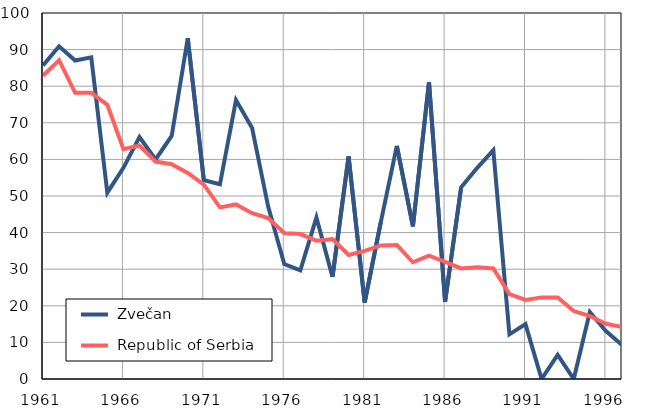
| Category |  Zvečan |  Republic of Serbia |
|---|---|---|
| 1961.0 | 85.7 | 82.9 |
| 1962.0 | 90.9 | 87.1 |
| 1963.0 | 87 | 78.2 |
| 1964.0 | 87.9 | 78.2 |
| 1965.0 | 50.9 | 74.9 |
| 1966.0 | 57.7 | 62.8 |
| 1967.0 | 66.1 | 63.8 |
| 1968.0 | 60 | 59.4 |
| 1969.0 | 66.4 | 58.7 |
| 1970.0 | 93.1 | 56.3 |
| 1971.0 | 54.3 | 53.1 |
| 1972.0 | 53.2 | 46.9 |
| 1973.0 | 76.2 | 47.7 |
| 1974.0 | 68.6 | 45.3 |
| 1975.0 | 47.1 | 44 |
| 1976.0 | 31.4 | 39.9 |
| 1977.0 | 29.7 | 39.6 |
| 1978.0 | 44.1 | 37.8 |
| 1979.0 | 27.9 | 38.2 |
| 1980.0 | 60.8 | 33.9 |
| 1981.0 | 20.9 | 35 |
| 1982.0 | 42.8 | 36.5 |
| 1983.0 | 63.7 | 36.6 |
| 1984.0 | 41.7 | 31.9 |
| 1985.0 | 81.1 | 33.7 |
| 1986.0 | 21.1 | 32 |
| 1987.0 | 52.4 | 30.2 |
| 1988.0 | 57.7 | 30.5 |
| 1989.0 | 62.5 | 30.2 |
| 1990.0 | 12.2 | 23.2 |
| 1991.0 | 15 | 21.6 |
| 1992.0 | 0 | 22.3 |
| 1993.0 | 6.6 | 22.3 |
| 1994.0 | 0 | 18.6 |
| 1995.0 | 18.3 | 17.2 |
| 1996.0 | 13.1 | 15.1 |
| 1997.0 | 9.3 | 14.2 |